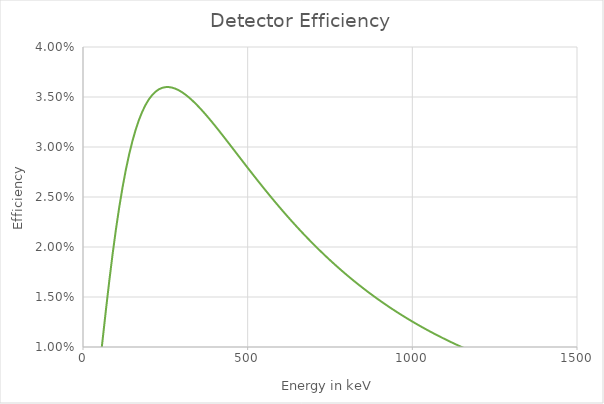
| Category | quadFit |
|---|---|
| 50.0 | 0.008 |
| 60.0 | 0.011 |
| 70.0 | 0.014 |
| 80.0 | 0.017 |
| 90.0 | 0.019 |
| 100.0 | 0.022 |
| 110.0 | 0.024 |
| 120.0 | 0.026 |
| 130.0 | 0.028 |
| 140.0 | 0.029 |
| 150.0 | 0.031 |
| 160.0 | 0.032 |
| 170.0 | 0.033 |
| 180.0 | 0.034 |
| 190.0 | 0.034 |
| 200.0 | 0.035 |
| 210.0 | 0.035 |
| 220.0 | 0.036 |
| 230.0 | 0.036 |
| 240.0 | 0.036 |
| 250.0 | 0.036 |
| 260.0 | 0.036 |
| 270.0 | 0.036 |
| 280.0 | 0.036 |
| 290.0 | 0.036 |
| 300.0 | 0.035 |
| 310.0 | 0.035 |
| 320.0 | 0.035 |
| 330.0 | 0.035 |
| 340.0 | 0.034 |
| 350.0 | 0.034 |
| 360.0 | 0.034 |
| 370.0 | 0.033 |
| 380.0 | 0.033 |
| 390.0 | 0.033 |
| 400.0 | 0.032 |
| 410.0 | 0.032 |
| 420.0 | 0.031 |
| 430.0 | 0.031 |
| 440.0 | 0.03 |
| 450.0 | 0.03 |
| 460.0 | 0.03 |
| 470.0 | 0.029 |
| 480.0 | 0.029 |
| 490.0 | 0.028 |
| 500.0 | 0.028 |
| 510.0 | 0.027 |
| 520.0 | 0.027 |
| 530.0 | 0.027 |
| 540.0 | 0.026 |
| 550.0 | 0.026 |
| 560.0 | 0.025 |
| 570.0 | 0.025 |
| 580.0 | 0.025 |
| 590.0 | 0.024 |
| 600.0 | 0.024 |
| 610.0 | 0.023 |
| 620.0 | 0.023 |
| 630.0 | 0.023 |
| 640.0 | 0.022 |
| 650.0 | 0.022 |
| 660.0 | 0.022 |
| 670.0 | 0.021 |
| 680.0 | 0.021 |
| 690.0 | 0.021 |
| 700.0 | 0.02 |
| 710.0 | 0.02 |
| 720.0 | 0.02 |
| 730.0 | 0.019 |
| 740.0 | 0.019 |
| 750.0 | 0.019 |
| 760.0 | 0.018 |
| 770.0 | 0.018 |
| 780.0 | 0.018 |
| 790.0 | 0.018 |
| 800.0 | 0.017 |
| 810.0 | 0.017 |
| 820.0 | 0.017 |
| 830.0 | 0.016 |
| 840.0 | 0.016 |
| 850.0 | 0.016 |
| 860.0 | 0.016 |
| 870.0 | 0.015 |
| 880.0 | 0.015 |
| 890.0 | 0.015 |
| 900.0 | 0.015 |
| 910.0 | 0.014 |
| 920.0 | 0.014 |
| 930.0 | 0.014 |
| 940.0 | 0.014 |
| 950.0 | 0.014 |
| 960.0 | 0.013 |
| 970.0 | 0.013 |
| 980.0 | 0.013 |
| 990.0 | 0.013 |
| 1000.0 | 0.013 |
| 1010.0 | 0.012 |
| 1020.0 | 0.012 |
| 1030.0 | 0.012 |
| 1040.0 | 0.012 |
| 1050.0 | 0.012 |
| 1060.0 | 0.011 |
| 1070.0 | 0.011 |
| 1080.0 | 0.011 |
| 1090.0 | 0.011 |
| 1100.0 | 0.011 |
| 1110.0 | 0.011 |
| 1120.0 | 0.01 |
| 1130.0 | 0.01 |
| 1140.0 | 0.01 |
| 1150.0 | 0.01 |
| 1160.0 | 0.01 |
| 1170.0 | 0.01 |
| 1180.0 | 0.01 |
| 1190.0 | 0.009 |
| 1200.0 | 0.009 |
| 1210.0 | 0.009 |
| 1220.0 | 0.009 |
| 1230.0 | 0.009 |
| 1240.0 | 0.009 |
| 1250.0 | 0.009 |
| 1260.0 | 0.009 |
| 1270.0 | 0.008 |
| 1280.0 | 0.008 |
| 1290.0 | 0.008 |
| 1300.0 | 0.008 |
| 1310.0 | 0.008 |
| 1320.0 | 0.008 |
| 1330.0 | 0.008 |
| 1340.0 | 0.008 |
| 1350.0 | 0.007 |
| 1360.0 | 0.007 |
| 1370.0 | 0.007 |
| 1380.0 | 0.007 |
| 1390.0 | 0.007 |
| 1400.0 | 0.007 |
| 1410.0 | 0.007 |